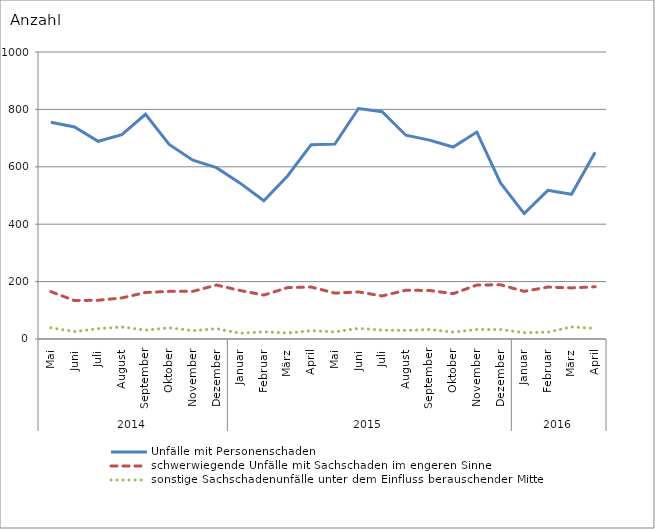
| Category | Unfälle mit Personenschaden | schwerwiegende Unfälle mit Sachschaden im engeren Sinne | sonstige Sachschadenunfälle unter dem Einfluss berauschender Mittel |
|---|---|---|---|
| 0 | 755 | 165 | 39 |
| 1 | 739 | 134 | 26 |
| 2 | 689 | 135 | 36 |
| 3 | 712 | 143 | 42 |
| 4 | 783 | 162 | 31 |
| 5 | 678 | 166 | 39 |
| 6 | 623 | 166 | 29 |
| 7 | 597 | 188 | 36 |
| 8 | 543 | 169 | 20 |
| 9 | 482 | 153 | 25 |
| 10 | 568 | 179 | 21 |
| 11 | 677 | 181 | 29 |
| 12 | 679 | 160 | 25 |
| 13 | 803 | 164 | 37 |
| 14 | 792 | 150 | 31 |
| 15 | 710 | 170 | 30 |
| 16 | 693 | 169 | 33 |
| 17 | 669 | 158 | 24 |
| 18 | 721 | 188 | 33 |
| 19 | 544 | 189 | 33 |
| 20 | 437 | 166 | 22 |
| 21 | 518 | 181 | 24 |
| 22 | 504 | 178 | 42 |
| 23 | 651 | 182 | 37 |